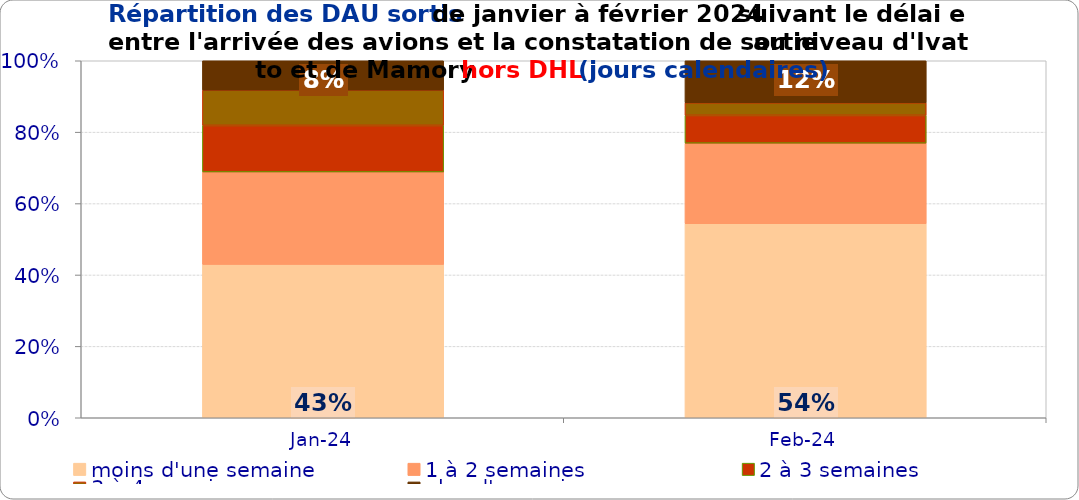
| Category | moins d'une semaine | 1 à 2 semaines | 2 à 3 semaines | 3 à 4 semaines | plus d'un mois |
|---|---|---|---|---|---|
| 2024-01-01 | 0.43 | 0.259 | 0.13 | 0.099 | 0.082 |
| 2024-02-01 | 0.543 | 0.226 | 0.078 | 0.035 | 0.118 |